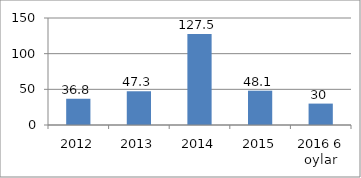
| Category | Series 0 |
|---|---|
| 2012 | 36.8 |
| 2013 | 47.3 |
| 2014 | 127.5 |
| 2015 | 48.1 |
| 2016 6 oylar | 30 |